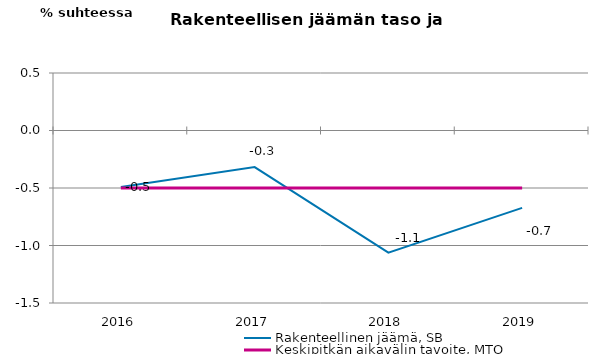
| Category | Rakenteellinen jäämä, SB | Keskipitkän aikavälin tavoite, MTO |
|---|---|---|
| 2016.0 | -0.491 | -0.5 |
| 2017.0 | -0.318 | -0.5 |
| 2018.0 | -1.062 | -0.5 |
| 2019.0 | -0.673 | -0.5 |